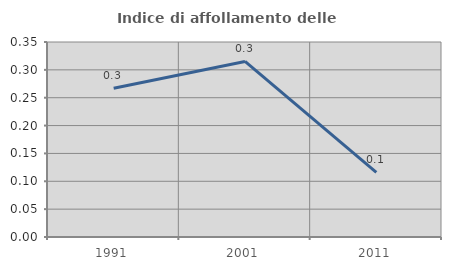
| Category | Indice di affollamento delle abitazioni  |
|---|---|
| 1991.0 | 0.267 |
| 2001.0 | 0.315 |
| 2011.0 | 0.116 |